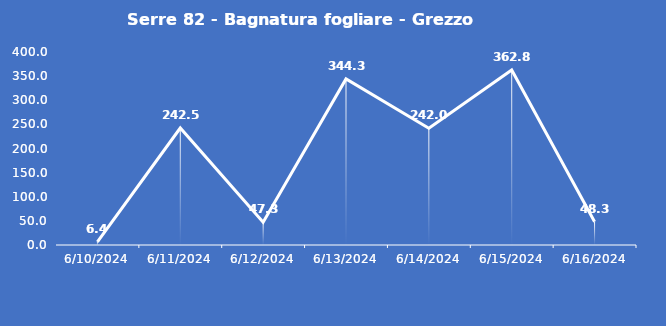
| Category | Serre 82 - Bagnatura fogliare - Grezzo (min) |
|---|---|
| 6/10/24 | 6.4 |
| 6/11/24 | 242.5 |
| 6/12/24 | 47.3 |
| 6/13/24 | 344.3 |
| 6/14/24 | 242 |
| 6/15/24 | 362.8 |
| 6/16/24 | 48.3 |